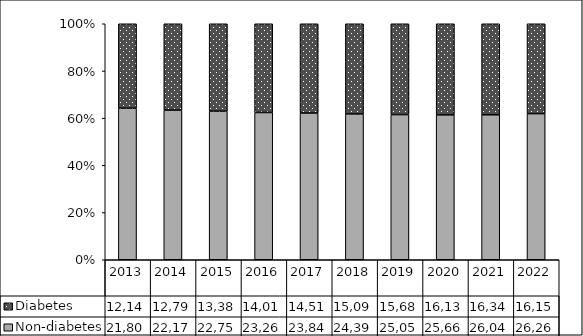
| Category | Non-diabetes | Diabetes |
|---|---|---|
| 2013 | 21804 | 12149 |
| 2014 | 22171 | 12794 |
| 2015 | 22751 | 13384 |
| 2016 | 23260 | 14016 |
| 2017 | 23847 | 14513 |
| 2018 | 24399 | 15094 |
| 2019 | 25058 | 15680 |
| 2020 | 25664 | 16131 |
| 2021 | 26043 | 16346 |
| 2022 | 26260 | 16151 |